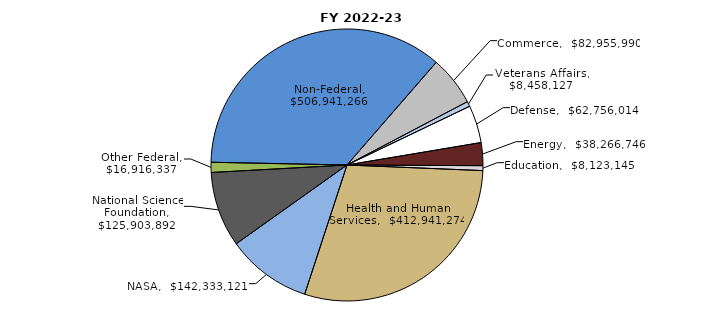
| Category | Series 0 |
|---|---|
| Commerce | 82955990 |
| Veterans Affairs | 8458127 |
| Defense | 62756014 |
| Energy | 38266746 |
| Education | 8123145 |
| Health and Human Services | 412941274 |
| NASA | 142333121 |
| National Science Foundation | 125903892 |
| Other Federal | 16916337 |
| Non-Federal | 506941266 |